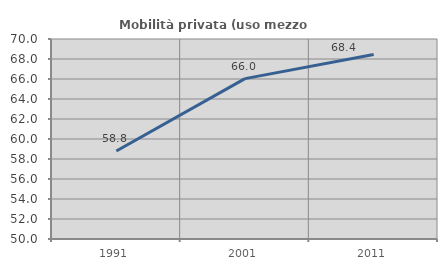
| Category | Mobilità privata (uso mezzo privato) |
|---|---|
| 1991.0 | 58.797 |
| 2001.0 | 66.036 |
| 2011.0 | 68.442 |